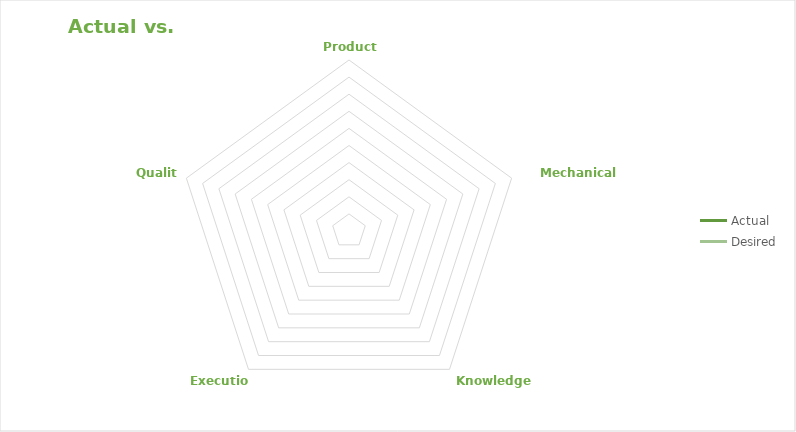
| Category | Actual | Desired |
|---|---|---|
| Product Process | 0 | 0 |
| Mechanical Process | 0 | 0 |
| Knowledge gain | 0 | 0 |
| Execution | 0 | 0 |
| Quality | 0 | 0 |